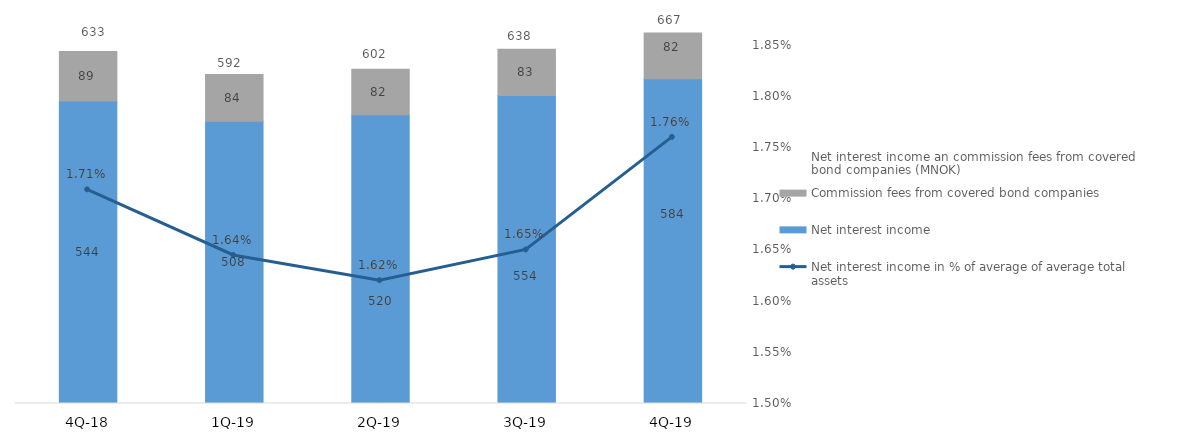
| Category | Net interest income | Commission fees from covered bond companies |
|---|---|---|
| 4Q-19 | 584.355 | 82.264 |
| 3Q-19 | 554.269 | 83.345 |
| 2Q-19 | 519.574 | 82.097 |
| 1Q-19 | 508 | 84.154 |
| 4Q-18 | 544.319 | 88.946 |